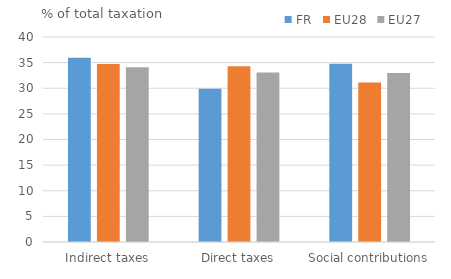
| Category | FR | EU28 | EU27 |
|---|---|---|---|
| Indirect taxes | 35.94 | 34.748 | 34.122 |
| Direct taxes | 29.92 | 34.27 | 33.09 |
| Social contributions | 34.769 | 31.135 | 32.964 |